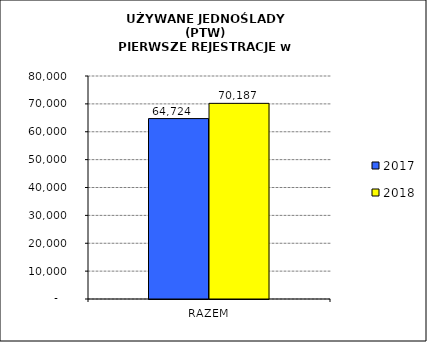
| Category | 2017 | 2018 |
|---|---|---|
| RAZEM | 64724 | 70187 |